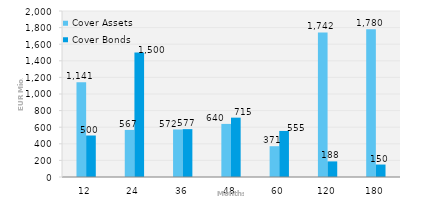
| Category | Cover Assets | Cover Bonds |
|---|---|---|
| 12.0 | 1140.754 | 500 |
| 24.0 | 567.291 | 1500 |
| 36.0 | 572.406 | 576.656 |
| 48.0 | 639.758 | 715 |
| 60.0 | 370.952 | 555 |
| 120.0 | 1741.623 | 188 |
| 180.0 | 1779.8 | 150 |